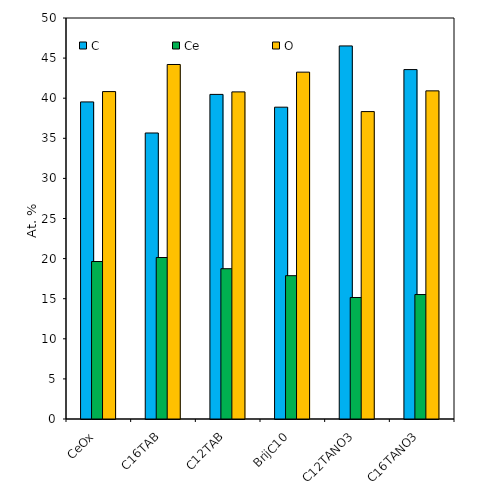
| Category | C | Ce  | O |
|---|---|---|---|
| CeOx | 39.537 | 19.638 | 40.825 |
| C16TAB | 35.661 | 20.136 | 44.202 |
| C12TAB | 40.474 | 18.739 | 40.788 |
| BrijC10 | 38.881 | 17.87 | 43.249 |
| C12TANO3 | 46.517 | 15.152 | 38.332 |
| C16TANO3 | 43.568 | 15.518 | 40.914 |